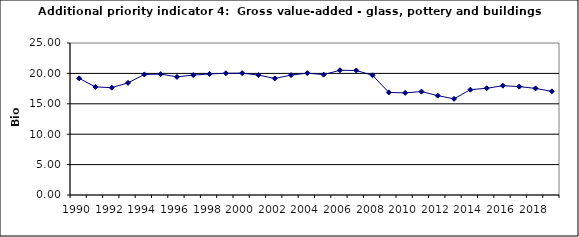
| Category | Gross value-added - glass, pottery and buildings materials industry, Bio Euro (EC95) |
|---|---|
| 1990 | 19.182 |
| 1991 | 17.78 |
| 1992 | 17.657 |
| 1993 | 18.446 |
| 1994 | 19.831 |
| 1995 | 19.884 |
| 1996 | 19.428 |
| 1997 | 19.726 |
| 1998 | 19.901 |
| 1999 | 20.024 |
| 2000 | 20.042 |
| 2001 | 19.726 |
| 2002 | 19.165 |
| 2003 | 19.726 |
| 2004 | 20.042 |
| 2005 | 19.796 |
| 2006 | 20.515 |
| 2007 | 20.48 |
| 2008 | 19.691 |
| 2009 | 16.868 |
| 2010 | 16.798 |
| 2011 | 17.008 |
| 2012 | 16.342 |
| 2013 | 15.816 |
| 2014 | 17.324 |
| 2015 | 17.552 |
| 2016 | 17.973 |
| 2017 | 17.832 |
| 2018 | 17.534 |
| 2019 | 17.043 |